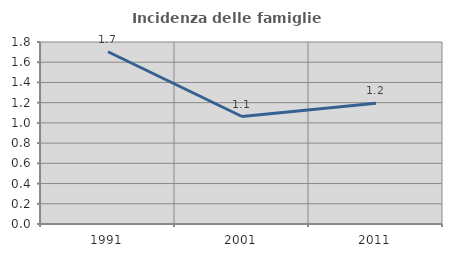
| Category | Incidenza delle famiglie numerose |
|---|---|
| 1991.0 | 1.704 |
| 2001.0 | 1.063 |
| 2011.0 | 1.195 |